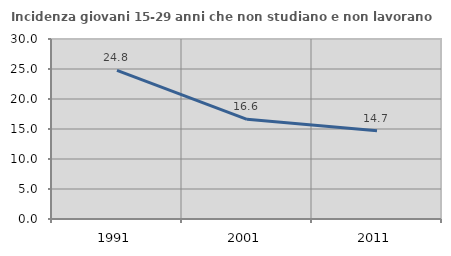
| Category | Incidenza giovani 15-29 anni che non studiano e non lavorano  |
|---|---|
| 1991.0 | 24.762 |
| 2001.0 | 16.612 |
| 2011.0 | 14.721 |